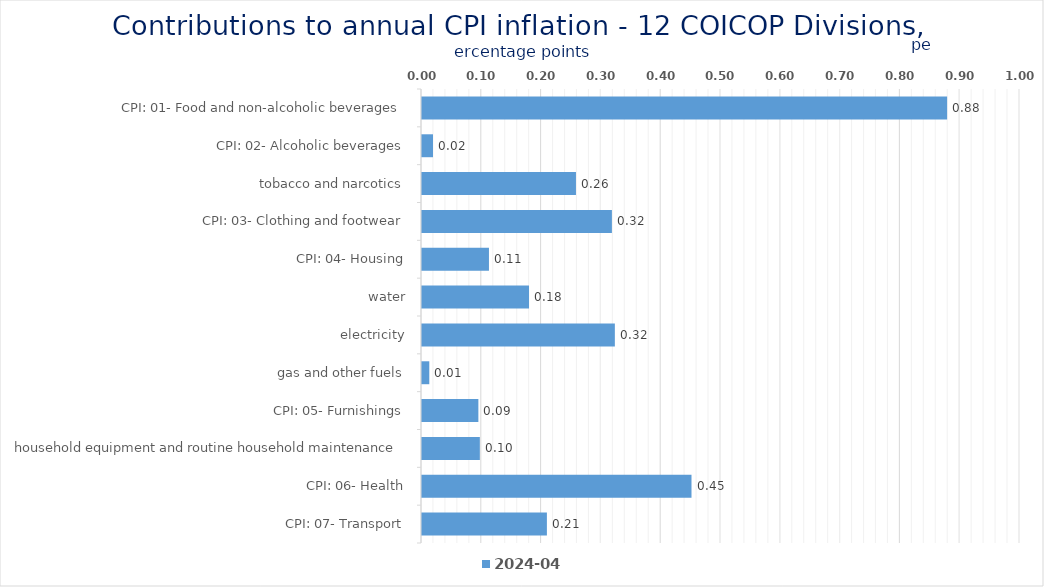
| Category | 2024-04 |
|---|---|
| CPI: 01- Food and non-alcoholic beverages | 0.878 |
| CPI: 02- Alcoholic beverages, tobacco and narcotics | 0.018 |
| CPI: 03- Clothing and footwear | 0.257 |
| CPI: 04- Housing, water, electricity, gas and other fuels | 0.318 |
| CPI: 05- Furnishings, household equipment and routine household maintenance | 0.112 |
| CPI: 06- Health | 0.179 |
| CPI: 07- Transport | 0.323 |
| CPI: 08- Communication | 0.012 |
| CPI: 09- Recreation and culture | 0.094 |
| CPI: 10- Education | 0.097 |
| CPI: 11- Restaurants and hotels | 0.451 |
| CPI: 12- Miscellaneous goods and services | 0.209 |